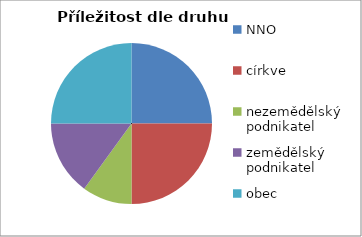
| Category | Příležitost dle druhu žadatele |
|---|---|
| NNO | 5 |
| církve | 5 |
| nezemědělský podnikatel | 2 |
| zemědělský podnikatel | 3 |
| obec | 5 |